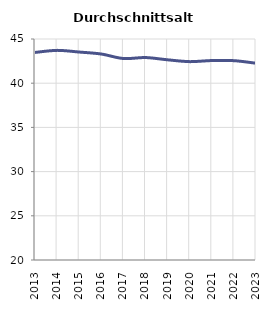
| Category | Durchschnittsalter |
|---|---|
| 2013.0 | 43.479 |
| 2014.0 | 43.713 |
| 2015.0 | 43.524 |
| 2016.0 | 43.299 |
| 2017.0 | 42.791 |
| 2018.0 | 42.903 |
| 2019.0 | 42.646 |
| 2020.0 | 42.44 |
| 2021.0 | 42.563 |
| 2022.0 | 42.55 |
| 2023.0 | 42.259 |